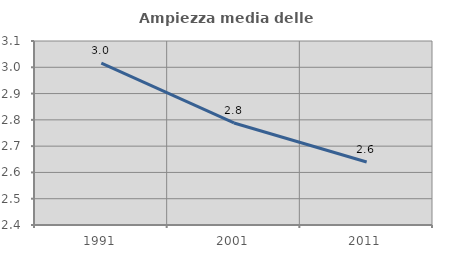
| Category | Ampiezza media delle famiglie |
|---|---|
| 1991.0 | 3.016 |
| 2001.0 | 2.788 |
| 2011.0 | 2.64 |